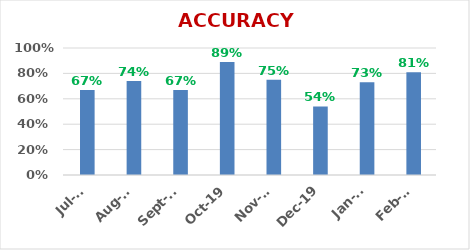
| Category | ACCURACY |
|---|---|
| 2020-02-01 | 0.81 |
| 2020-01-01 | 0.73 |
| 2019-12-01 | 0.54 |
| 2019-11-01 | 0.75 |
| 2019-10-01 | 0.89 |
| 2019-09-01 | 0.67 |
| 2019-08-01 | 0.74 |
| 2019-07-01 | 0.67 |